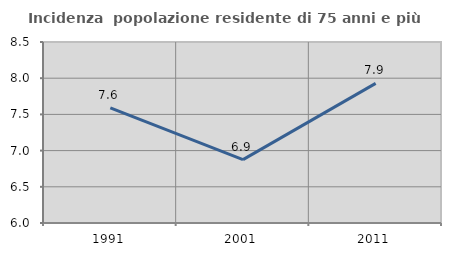
| Category | Incidenza  popolazione residente di 75 anni e più |
|---|---|
| 1991.0 | 7.591 |
| 2001.0 | 6.876 |
| 2011.0 | 7.929 |